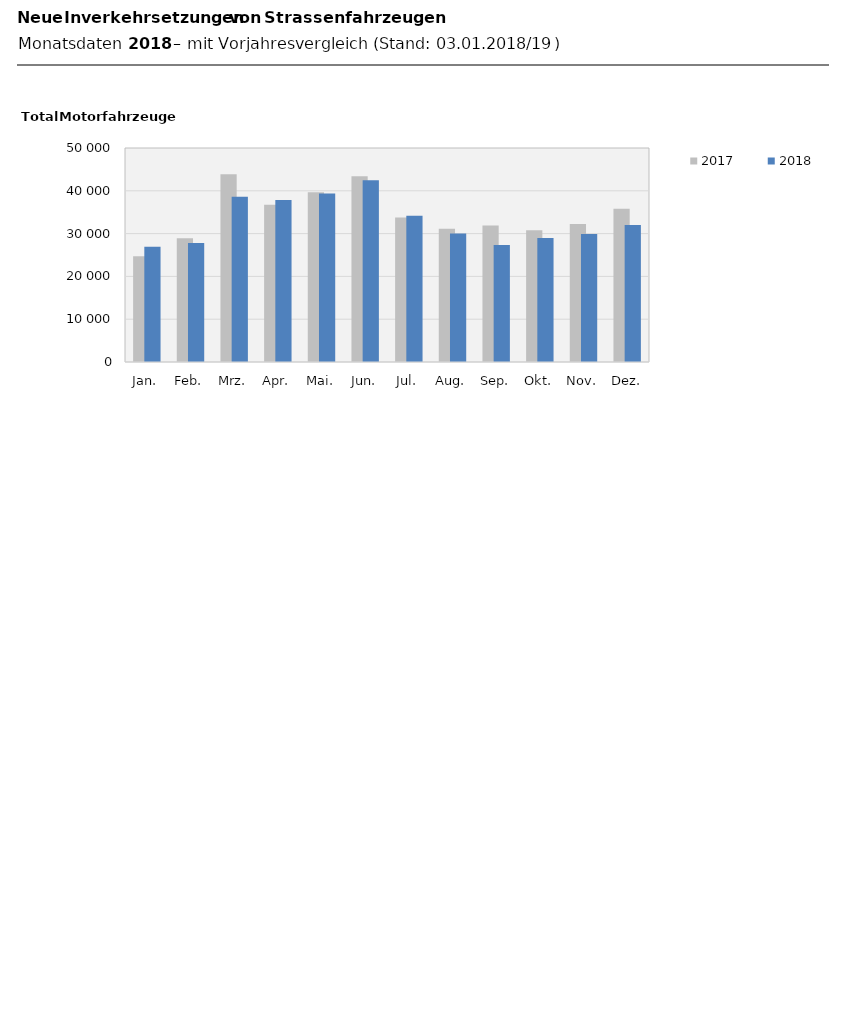
| Category | 2017 | 2018 |
|---|---|---|
| Jan. | 24684 | 26923 |
| Feb. | 28910 | 27829 |
| Mrz. | 43850 | 38587 |
| Apr. | 36715 | 37846 |
| Mai. | 39663 | 39349 |
| Jun. | 43373 | 42480 |
| Jul. | 33772 | 34171 |
| Aug. | 31139 | 30026 |
| Sep. | 31894 | 27310 |
| Okt. | 30790 | 28966 |
| Nov. | 32246 | 29910 |
| Dez. | 35791 | 32016 |